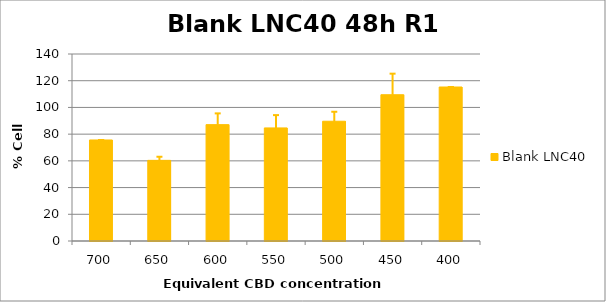
| Category | Blank LNC40 |
|---|---|
| 700.0 | 75.635 |
| 650.0 | 60.379 |
| 600.0 | 87.123 |
| 550.0 | 84.661 |
| 500.0 | 89.653 |
| 450.0 | 109.513 |
| 400.0 | 115.292 |